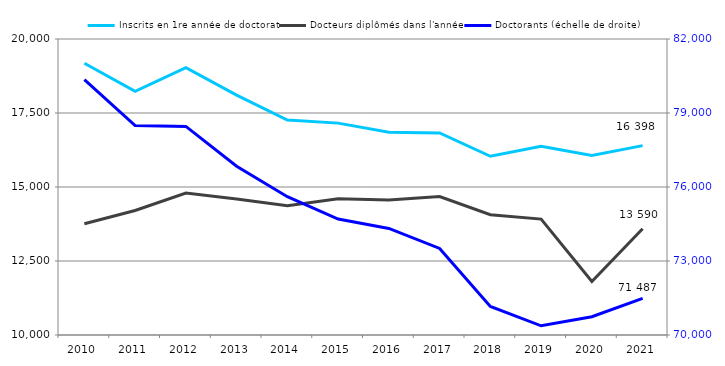
| Category | Inscrits en 1re année de doctorat | Docteurs diplômés dans l'année |
|---|---|---|
| 2010.0 | 19182 | 13758 |
| 2011.0 | 18232 | 14207 |
| 2012.0 | 19031 | 14796 |
| 2013.0 | 18103 | 14596 |
| 2014.0 | 17262 | 14366 |
| 2015.0 | 17158 | 14606 |
| 2016.0 | 16847 | 14565 |
| 2017.0 | 16827 | 14678 |
| 2018.0 | 16039 | 14065 |
| 2019.0 | 16374 | 13915 |
| 2020.0 | 16069 | 11806 |
| 2021.0 | 16398 | 13590 |